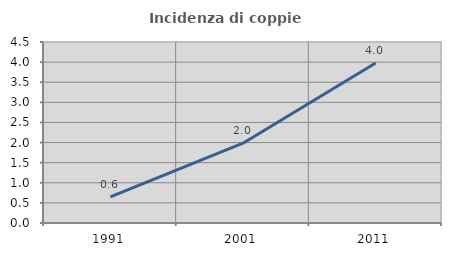
| Category | Incidenza di coppie miste |
|---|---|
| 1991.0 | 0.648 |
| 2001.0 | 1.984 |
| 2011.0 | 3.977 |